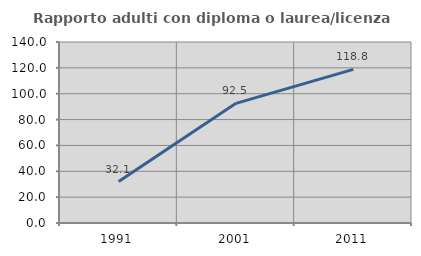
| Category | Rapporto adulti con diploma o laurea/licenza media  |
|---|---|
| 1991.0 | 32.061 |
| 2001.0 | 92.537 |
| 2011.0 | 118.8 |